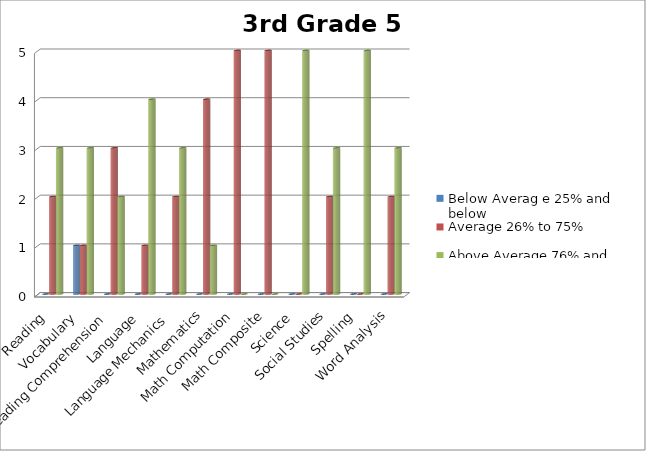
| Category | Below Averag e 25% and below | Average 26% to 75% | Above Average 76% and above |
|---|---|---|---|
| Reading  | 0 | 2 | 3 |
| Vocabulary | 1 | 1 | 3 |
| Reading Comprehension | 0 | 3 | 2 |
| Language | 0 | 1 | 4 |
| Language Mechanics | 0 | 2 | 3 |
| Mathematics | 0 | 4 | 1 |
| Math Computation | 0 | 5 | 0 |
| Math Composite | 0 | 5 | 0 |
| Science | 0 | 0 | 5 |
| Social Studies | 0 | 2 | 3 |
| Spelling | 0 | 0 | 5 |
| Word Analysis | 0 | 2 | 3 |